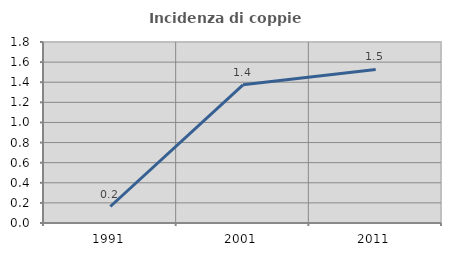
| Category | Incidenza di coppie miste |
|---|---|
| 1991.0 | 0.164 |
| 2001.0 | 1.375 |
| 2011.0 | 1.527 |